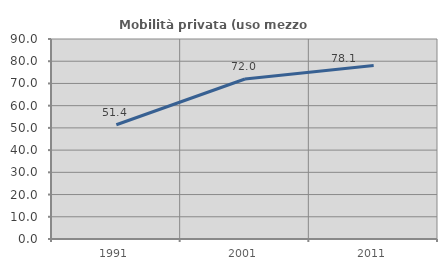
| Category | Mobilità privata (uso mezzo privato) |
|---|---|
| 1991.0 | 51.422 |
| 2001.0 | 72.007 |
| 2011.0 | 78.105 |